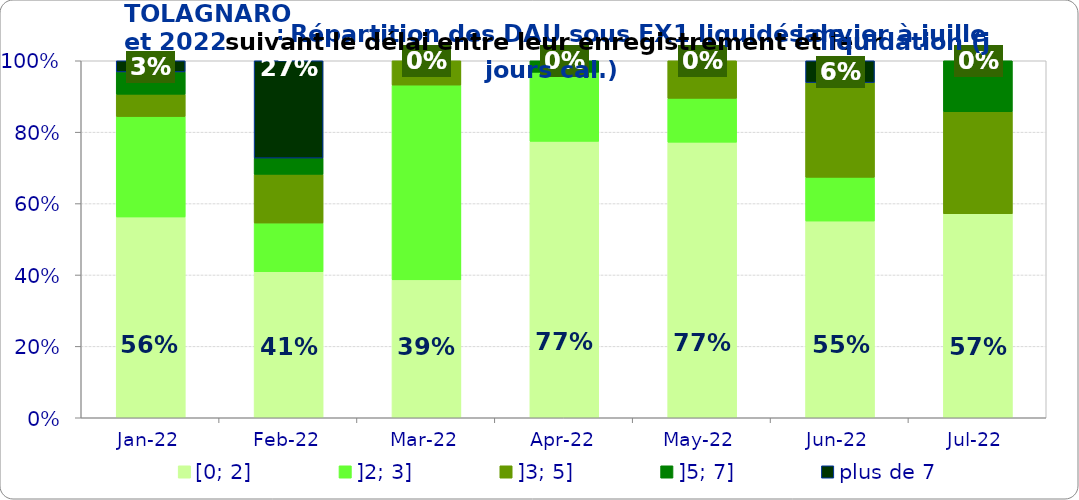
| Category | [0; 2] | ]2; 3] | ]3; 5] | ]5; 7] | plus de 7 |
|---|---|---|---|---|---|
| 2022-01-01 | 0.562 | 0.281 | 0.062 | 0.062 | 0.031 |
| 2022-02-01 | 0.409 | 0.136 | 0.136 | 0.045 | 0.273 |
| 2022-03-01 | 0.386 | 0.545 | 0.068 | 0 | 0 |
| 2022-04-01 | 0.774 | 0.194 | 0 | 0.032 | 0 |
| 2022-05-01 | 0.772 | 0.123 | 0.105 | 0 | 0 |
| 2022-06-01 | 0.551 | 0.122 | 0.265 | 0 | 0.061 |
| 2022-07-01 | 0.571 | 0 | 0.286 | 0.143 | 0 |